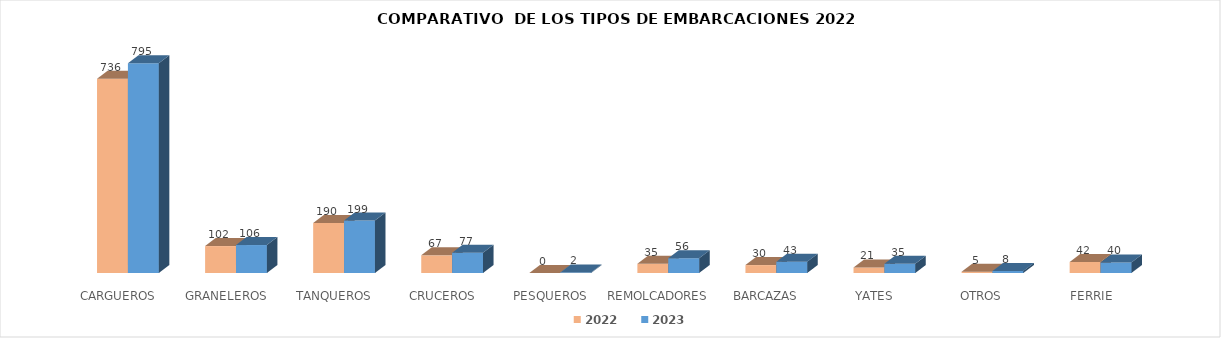
| Category | 2022 | 2023 |
|---|---|---|
| CARGUEROS | 736 | 795 |
| GRANELEROS | 102 | 106 |
| TANQUEROS | 190 | 199 |
| CRUCEROS | 67 | 77 |
| PESQUEROS | 0 | 2 |
| REMOLCADORES | 35 | 56 |
| BARCAZAS | 30 | 43 |
| YATES | 21 | 35 |
| OTROS  | 5 | 8 |
| FERRIE | 42 | 40 |